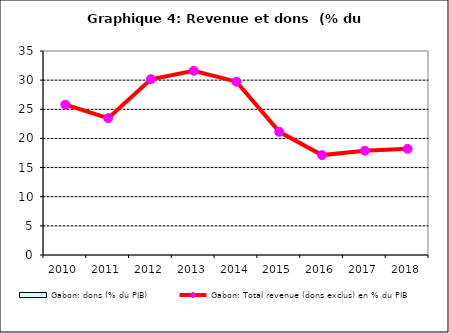
| Category | Gabon: dons (% du PIB) |
|---|---|
| 2010.0 | 0 |
| 2011.0 | 0 |
| 2012.0 | 0 |
| 2013.0 | 0 |
| 2014.0 | 0 |
| 2015.0 | 0 |
| 2016.0 | 0 |
| 2017.0 | 0 |
| 2018.0 | 0 |